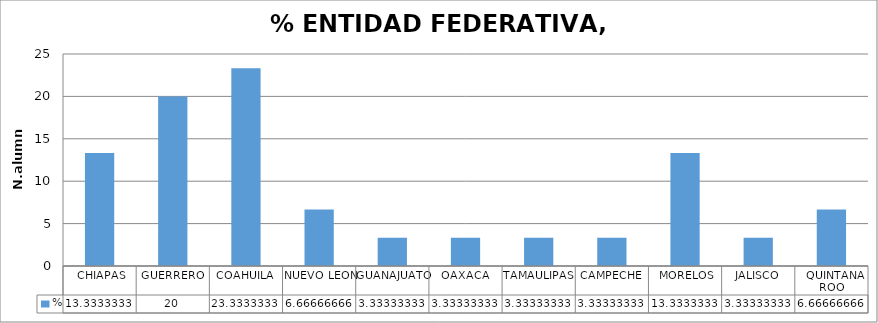
| Category | % |
|---|---|
|  CHIAPAS | 13.333 |
| GUERRERO | 20 |
| COAHUILA | 23.333 |
| NUEVO LEON | 6.667 |
| GUANAJUATO | 3.333 |
| OAXACA | 3.333 |
| TAMAULIPAS | 3.333 |
| CAMPECHE | 3.333 |
|  MORELOS | 13.333 |
| JALISCO | 3.333 |
|  QUINTANA ROO | 6.667 |